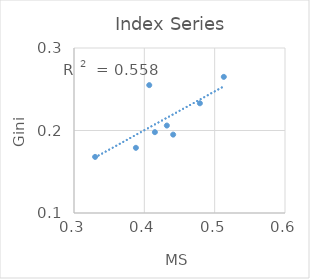
| Category | ind-gini |
|---|---|
| 0.441 | 0.195 |
| 0.415 | 0.198 |
| 0.513 | 0.265 |
| 0.479 | 0.233 |
| 0.33 | 0.168 |
| 0.407 | 0.255 |
| 0.432 | 0.206 |
| 0.388 | 0.179 |